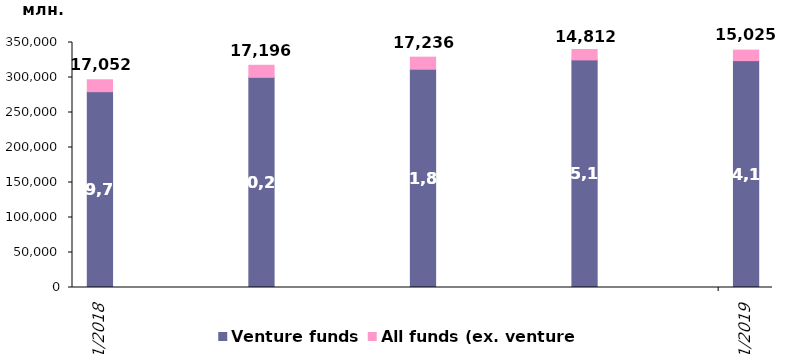
| Category | Venture funds | All funds (ex. venture) |
|---|---|---|
| 12/31/18 | 279713.253 | 17052.128 |
| 3/31/19 | 300241.731 | 17195.754 |
| 6/30/19 | 311811.926 | 17235.598 |
| 9/30/19 | 325109.898 | 14811.829 |
| 12/31/19 | 324105.005 | 15024.795 |